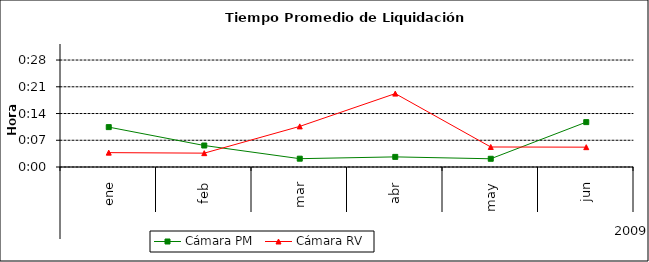
| Category | Cámara PM | Cámara RV |
|---|---|---|
| 0 | 0.007 | 0.003 |
| 1 | 0.004 | 0.003 |
| 2 | 0.002 | 0.008 |
| 3 | 0.002 | 0.014 |
| 4 | 0.002 | 0.004 |
| 5 | 0.008 | 0.004 |